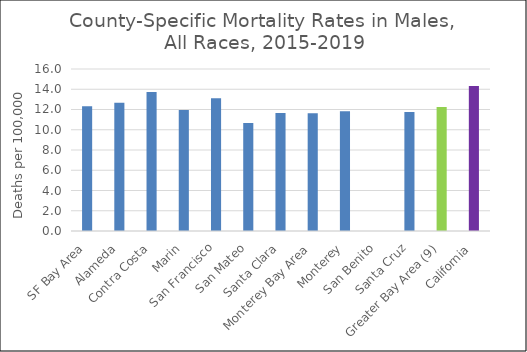
| Category | Male |
|---|---|
| SF Bay Area | 12.32 |
|   Alameda | 12.66 |
|   Contra Costa | 13.72 |
|   Marin | 11.95 |
|   San Francisco | 13.12 |
|   San Mateo | 10.66 |
|   Santa Clara | 11.66 |
| Monterey Bay Area | 11.64 |
|   Monterey | 11.83 |
|   San Benito | 0 |
|   Santa Cruz | 11.76 |
| Greater Bay Area (9) | 12.25 |
| California | 14.31 |